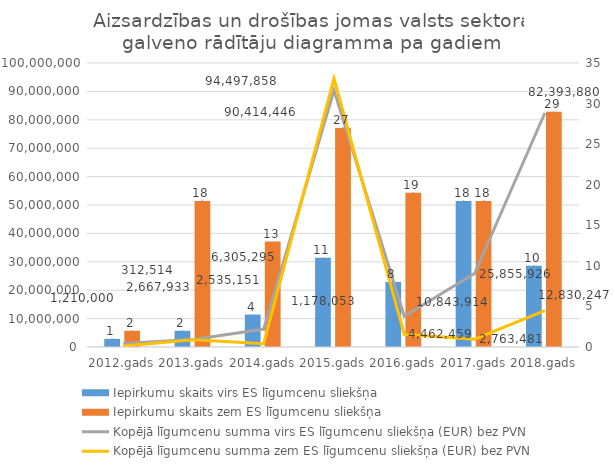
| Category | Iepirkumu skaits virs ES līgumcenu sliekšņa | Iepirkumu skaits zem ES līgumcenu sliekšņa |
|---|---|---|
| 2012.gads | 1 | 2 |
| 2013.gads | 2 | 18 |
| 2014.gads | 4 | 13 |
| 2015.gads | 11 | 27 |
| 2016.gads | 8 | 19 |
| 2017.gads | 18 | 18 |
| 2018.gads | 10 | 29 |